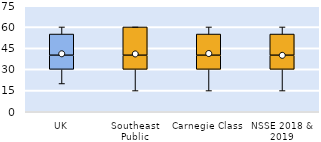
| Category | 25th | 50th | 75th |
|---|---|---|---|
| UK | 30 | 10 | 15 |
| Southeast Public | 30 | 10 | 20 |
| Carnegie Class | 30 | 10 | 15 |
| NSSE 2018 & 2019 | 30 | 10 | 15 |